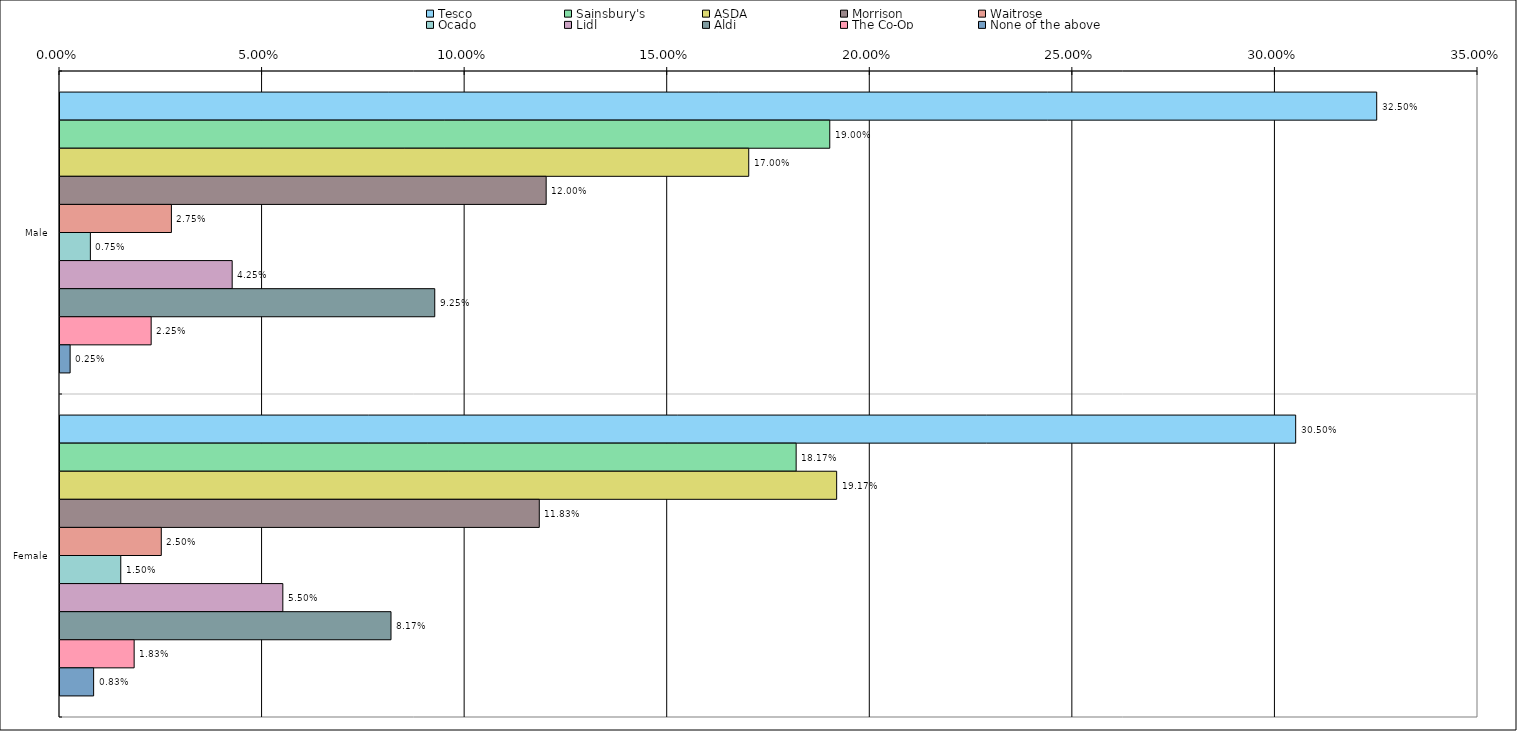
| Category | Tesco | Sainsbury's | ASDA | Morrison | Waitrose | Ocado | Lidl | Aldi | The Co-Op | None of the above |
|---|---|---|---|---|---|---|---|---|---|---|
| 0 | 0.325 | 0.19 | 0.17 | 0.12 | 0.028 | 0.008 | 0.042 | 0.092 | 0.022 | 0.002 |
| 1 | 0.305 | 0.182 | 0.192 | 0.118 | 0.025 | 0.015 | 0.055 | 0.082 | 0.018 | 0.008 |